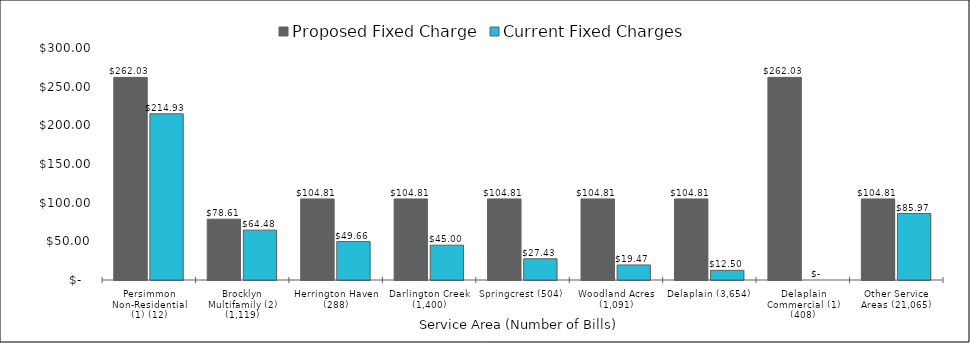
| Category | Proposed Fixed Charge | Current Fixed Charges |
|---|---|---|
| Persimmon Non-Residential (1) (12) | 262.025 | 214.925 |
| Brocklyn Multifamily (2) (1,119) | 78.608 | 64.48 |
| Herrington Haven (288) | 104.81 | 49.66 |
| Darlington Creek (1,400) | 104.81 | 45 |
| Springcrest (504) | 104.81 | 27.43 |
| Woodland Acres (1,091) | 104.81 | 19.47 |
| Delaplain (3,654) | 104.81 | 12.5 |
| Delaplain Commercial (1) (408) | 262.025 | 0 |
| Other Service Areas (21,065) | 104.81 | 85.97 |